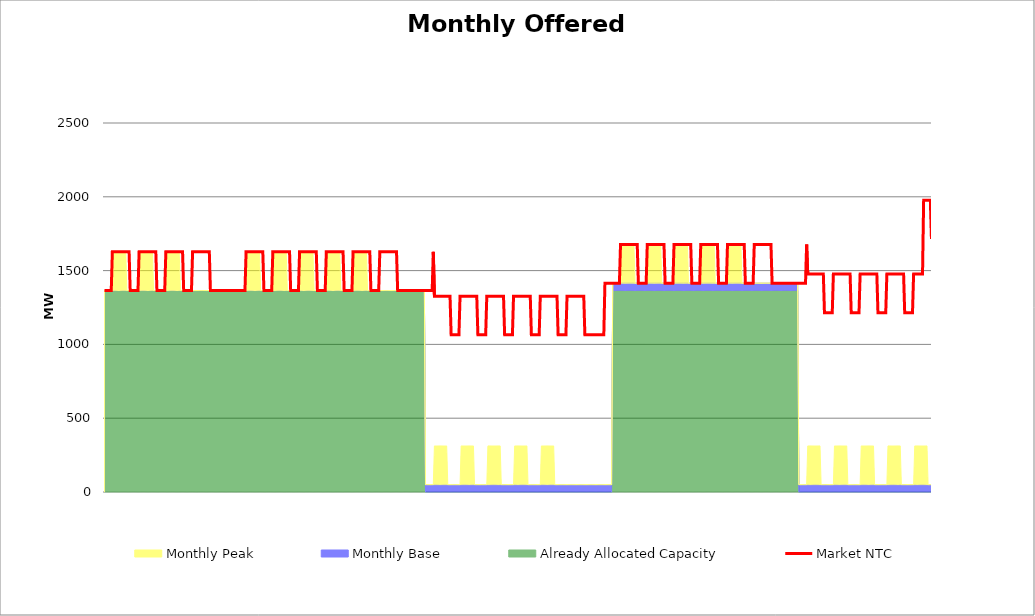
| Category | Market NTC |
|---|---|
| 0 | 1365 |
| 1 | 1365 |
| 2 | 1365 |
| 3 | 1365 |
| 4 | 1365 |
| 5 | 1365 |
| 6 | 1365 |
| 7 | 1627 |
| 8 | 1627 |
| 9 | 1627 |
| 10 | 1627 |
| 11 | 1627 |
| 12 | 1627 |
| 13 | 1627 |
| 14 | 1627 |
| 15 | 1627 |
| 16 | 1627 |
| 17 | 1627 |
| 18 | 1627 |
| 19 | 1627 |
| 20 | 1627 |
| 21 | 1627 |
| 22 | 1627 |
| 23 | 1365 |
| 24 | 1365 |
| 25 | 1365 |
| 26 | 1365 |
| 27 | 1365 |
| 28 | 1365 |
| 29 | 1365 |
| 30 | 1365 |
| 31 | 1627 |
| 32 | 1627 |
| 33 | 1627 |
| 34 | 1627 |
| 35 | 1627 |
| 36 | 1627 |
| 37 | 1627 |
| 38 | 1627 |
| 39 | 1627 |
| 40 | 1627 |
| 41 | 1627 |
| 42 | 1627 |
| 43 | 1627 |
| 44 | 1627 |
| 45 | 1627 |
| 46 | 1627 |
| 47 | 1365 |
| 48 | 1365 |
| 49 | 1365 |
| 50 | 1365 |
| 51 | 1365 |
| 52 | 1365 |
| 53 | 1365 |
| 54 | 1365 |
| 55 | 1627 |
| 56 | 1627 |
| 57 | 1627 |
| 58 | 1627 |
| 59 | 1627 |
| 60 | 1627 |
| 61 | 1627 |
| 62 | 1627 |
| 63 | 1627 |
| 64 | 1627 |
| 65 | 1627 |
| 66 | 1627 |
| 67 | 1627 |
| 68 | 1627 |
| 69 | 1627 |
| 70 | 1627 |
| 71 | 1365 |
| 72 | 1365 |
| 73 | 1365 |
| 74 | 1365 |
| 75 | 1365 |
| 76 | 1365 |
| 77 | 1365 |
| 78 | 1365 |
| 79 | 1627 |
| 80 | 1627 |
| 81 | 1627 |
| 82 | 1627 |
| 83 | 1627 |
| 84 | 1627 |
| 85 | 1627 |
| 86 | 1627 |
| 87 | 1627 |
| 88 | 1627 |
| 89 | 1627 |
| 90 | 1627 |
| 91 | 1627 |
| 92 | 1627 |
| 93 | 1627 |
| 94 | 1627 |
| 95 | 1365 |
| 96 | 1365 |
| 97 | 1365 |
| 98 | 1365 |
| 99 | 1365 |
| 100 | 1365 |
| 101 | 1365 |
| 102 | 1365 |
| 103 | 1365 |
| 104 | 1365 |
| 105 | 1365 |
| 106 | 1365 |
| 107 | 1365 |
| 108 | 1365 |
| 109 | 1365 |
| 110 | 1365 |
| 111 | 1365 |
| 112 | 1365 |
| 113 | 1365 |
| 114 | 1365 |
| 115 | 1365 |
| 116 | 1365 |
| 117 | 1365 |
| 118 | 1365 |
| 119 | 1365 |
| 120 | 1365 |
| 121 | 1365 |
| 122 | 1365 |
| 123 | 1365 |
| 124 | 1365 |
| 125 | 1365 |
| 126 | 1365 |
| 127 | 1627 |
| 128 | 1627 |
| 129 | 1627 |
| 130 | 1627 |
| 131 | 1627 |
| 132 | 1627 |
| 133 | 1627 |
| 134 | 1627 |
| 135 | 1627 |
| 136 | 1627 |
| 137 | 1627 |
| 138 | 1627 |
| 139 | 1627 |
| 140 | 1627 |
| 141 | 1627 |
| 142 | 1627 |
| 143 | 1365 |
| 144 | 1365 |
| 145 | 1365 |
| 146 | 1365 |
| 147 | 1365 |
| 148 | 1365 |
| 149 | 1365 |
| 150 | 1365 |
| 151 | 1627 |
| 152 | 1627 |
| 153 | 1627 |
| 154 | 1627 |
| 155 | 1627 |
| 156 | 1627 |
| 157 | 1627 |
| 158 | 1627 |
| 159 | 1627 |
| 160 | 1627 |
| 161 | 1627 |
| 162 | 1627 |
| 163 | 1627 |
| 164 | 1627 |
| 165 | 1627 |
| 166 | 1627 |
| 167 | 1365 |
| 168 | 1365 |
| 169 | 1365 |
| 170 | 1365 |
| 171 | 1365 |
| 172 | 1365 |
| 173 | 1365 |
| 174 | 1365 |
| 175 | 1627 |
| 176 | 1627 |
| 177 | 1627 |
| 178 | 1627 |
| 179 | 1627 |
| 180 | 1627 |
| 181 | 1627 |
| 182 | 1627 |
| 183 | 1627 |
| 184 | 1627 |
| 185 | 1627 |
| 186 | 1627 |
| 187 | 1627 |
| 188 | 1627 |
| 189 | 1627 |
| 190 | 1627 |
| 191 | 1365 |
| 192 | 1365 |
| 193 | 1365 |
| 194 | 1365 |
| 195 | 1365 |
| 196 | 1365 |
| 197 | 1365 |
| 198 | 1365 |
| 199 | 1627 |
| 200 | 1627 |
| 201 | 1627 |
| 202 | 1627 |
| 203 | 1627 |
| 204 | 1627 |
| 205 | 1627 |
| 206 | 1627 |
| 207 | 1627 |
| 208 | 1627 |
| 209 | 1627 |
| 210 | 1627 |
| 211 | 1627 |
| 212 | 1627 |
| 213 | 1627 |
| 214 | 1627 |
| 215 | 1365 |
| 216 | 1365 |
| 217 | 1365 |
| 218 | 1365 |
| 219 | 1365 |
| 220 | 1365 |
| 221 | 1365 |
| 222 | 1365 |
| 223 | 1627 |
| 224 | 1627 |
| 225 | 1627 |
| 226 | 1627 |
| 227 | 1627 |
| 228 | 1627 |
| 229 | 1627 |
| 230 | 1627 |
| 231 | 1627 |
| 232 | 1627 |
| 233 | 1627 |
| 234 | 1627 |
| 235 | 1627 |
| 236 | 1627 |
| 237 | 1627 |
| 238 | 1627 |
| 239 | 1365 |
| 240 | 1365 |
| 241 | 1365 |
| 242 | 1365 |
| 243 | 1365 |
| 244 | 1365 |
| 245 | 1365 |
| 246 | 1365 |
| 247 | 1627 |
| 248 | 1627 |
| 249 | 1627 |
| 250 | 1627 |
| 251 | 1627 |
| 252 | 1627 |
| 253 | 1627 |
| 254 | 1627 |
| 255 | 1627 |
| 256 | 1627 |
| 257 | 1627 |
| 258 | 1627 |
| 259 | 1627 |
| 260 | 1627 |
| 261 | 1627 |
| 262 | 1627 |
| 263 | 1365 |
| 264 | 1365 |
| 265 | 1365 |
| 266 | 1365 |
| 267 | 1365 |
| 268 | 1365 |
| 269 | 1365 |
| 270 | 1365 |
| 271 | 1365 |
| 272 | 1365 |
| 273 | 1365 |
| 274 | 1365 |
| 275 | 1365 |
| 276 | 1365 |
| 277 | 1365 |
| 278 | 1365 |
| 279 | 1365 |
| 280 | 1365 |
| 281 | 1365 |
| 282 | 1365 |
| 283 | 1365 |
| 284 | 1365 |
| 285 | 1365 |
| 286 | 1365 |
| 287 | 1365 |
| 288 | 1365 |
| 289 | 1365 |
| 290 | 1365 |
| 291 | 1365 |
| 292 | 1365 |
| 293 | 1365 |
| 294 | 1365 |
| 295 | 1627 |
| 296 | 1327 |
| 297 | 1327 |
| 298 | 1327 |
| 299 | 1327 |
| 300 | 1327 |
| 301 | 1327 |
| 302 | 1327 |
| 303 | 1327 |
| 304 | 1327 |
| 305 | 1327 |
| 306 | 1327 |
| 307 | 1327 |
| 308 | 1327 |
| 309 | 1327 |
| 310 | 1327 |
| 311 | 1065 |
| 312 | 1065 |
| 313 | 1065 |
| 314 | 1065 |
| 315 | 1065 |
| 316 | 1065 |
| 317 | 1065 |
| 318 | 1065 |
| 319 | 1327 |
| 320 | 1327 |
| 321 | 1327 |
| 322 | 1327 |
| 323 | 1327 |
| 324 | 1327 |
| 325 | 1327 |
| 326 | 1327 |
| 327 | 1327 |
| 328 | 1327 |
| 329 | 1327 |
| 330 | 1327 |
| 331 | 1327 |
| 332 | 1327 |
| 333 | 1327 |
| 334 | 1327 |
| 335 | 1065 |
| 336 | 1065 |
| 337 | 1065 |
| 338 | 1065 |
| 339 | 1065 |
| 340 | 1065 |
| 341 | 1065 |
| 342 | 1065 |
| 343 | 1327 |
| 344 | 1327 |
| 345 | 1327 |
| 346 | 1327 |
| 347 | 1327 |
| 348 | 1327 |
| 349 | 1327 |
| 350 | 1327 |
| 351 | 1327 |
| 352 | 1327 |
| 353 | 1327 |
| 354 | 1327 |
| 355 | 1327 |
| 356 | 1327 |
| 357 | 1327 |
| 358 | 1327 |
| 359 | 1065 |
| 360 | 1065 |
| 361 | 1065 |
| 362 | 1065 |
| 363 | 1065 |
| 364 | 1065 |
| 365 | 1065 |
| 366 | 1065 |
| 367 | 1327 |
| 368 | 1327 |
| 369 | 1327 |
| 370 | 1327 |
| 371 | 1327 |
| 372 | 1327 |
| 373 | 1327 |
| 374 | 1327 |
| 375 | 1327 |
| 376 | 1327 |
| 377 | 1327 |
| 378 | 1327 |
| 379 | 1327 |
| 380 | 1327 |
| 381 | 1327 |
| 382 | 1327 |
| 383 | 1065 |
| 384 | 1065 |
| 385 | 1065 |
| 386 | 1065 |
| 387 | 1065 |
| 388 | 1065 |
| 389 | 1065 |
| 390 | 1065 |
| 391 | 1327 |
| 392 | 1327 |
| 393 | 1327 |
| 394 | 1327 |
| 395 | 1327 |
| 396 | 1327 |
| 397 | 1327 |
| 398 | 1327 |
| 399 | 1327 |
| 400 | 1327 |
| 401 | 1327 |
| 402 | 1327 |
| 403 | 1327 |
| 404 | 1327 |
| 405 | 1327 |
| 406 | 1327 |
| 407 | 1065 |
| 408 | 1065 |
| 409 | 1065 |
| 410 | 1065 |
| 411 | 1065 |
| 412 | 1065 |
| 413 | 1065 |
| 414 | 1065 |
| 415 | 1327 |
| 416 | 1327 |
| 417 | 1327 |
| 418 | 1327 |
| 419 | 1327 |
| 420 | 1327 |
| 421 | 1327 |
| 422 | 1327 |
| 423 | 1327 |
| 424 | 1327 |
| 425 | 1327 |
| 426 | 1327 |
| 427 | 1327 |
| 428 | 1327 |
| 429 | 1327 |
| 430 | 1327 |
| 431 | 1065 |
| 432 | 1065 |
| 433 | 1065 |
| 434 | 1065 |
| 435 | 1065 |
| 436 | 1065 |
| 437 | 1065 |
| 438 | 1065 |
| 439 | 1065 |
| 440 | 1065 |
| 441 | 1065 |
| 442 | 1065 |
| 443 | 1065 |
| 444 | 1065 |
| 445 | 1065 |
| 446 | 1065 |
| 447 | 1065 |
| 448 | 1065 |
| 449 | 1415 |
| 450 | 1415 |
| 451 | 1415 |
| 452 | 1415 |
| 453 | 1415 |
| 454 | 1415 |
| 455 | 1415 |
| 456 | 1415 |
| 457 | 1415 |
| 458 | 1415 |
| 459 | 1415 |
| 460 | 1415 |
| 461 | 1415 |
| 462 | 1415 |
| 463 | 1677 |
| 464 | 1677 |
| 465 | 1677 |
| 466 | 1677 |
| 467 | 1677 |
| 468 | 1677 |
| 469 | 1677 |
| 470 | 1677 |
| 471 | 1677 |
| 472 | 1677 |
| 473 | 1677 |
| 474 | 1677 |
| 475 | 1677 |
| 476 | 1677 |
| 477 | 1677 |
| 478 | 1677 |
| 479 | 1415 |
| 480 | 1415 |
| 481 | 1415 |
| 482 | 1415 |
| 483 | 1415 |
| 484 | 1415 |
| 485 | 1415 |
| 486 | 1415 |
| 487 | 1677 |
| 488 | 1677 |
| 489 | 1677 |
| 490 | 1677 |
| 491 | 1677 |
| 492 | 1677 |
| 493 | 1677 |
| 494 | 1677 |
| 495 | 1677 |
| 496 | 1677 |
| 497 | 1677 |
| 498 | 1677 |
| 499 | 1677 |
| 500 | 1677 |
| 501 | 1677 |
| 502 | 1677 |
| 503 | 1415 |
| 504 | 1415 |
| 505 | 1415 |
| 506 | 1415 |
| 507 | 1415 |
| 508 | 1415 |
| 509 | 1415 |
| 510 | 1415 |
| 511 | 1677 |
| 512 | 1677 |
| 513 | 1677 |
| 514 | 1677 |
| 515 | 1677 |
| 516 | 1677 |
| 517 | 1677 |
| 518 | 1677 |
| 519 | 1677 |
| 520 | 1677 |
| 521 | 1677 |
| 522 | 1677 |
| 523 | 1677 |
| 524 | 1677 |
| 525 | 1677 |
| 526 | 1677 |
| 527 | 1415 |
| 528 | 1415 |
| 529 | 1415 |
| 530 | 1415 |
| 531 | 1415 |
| 532 | 1415 |
| 533 | 1415 |
| 534 | 1415 |
| 535 | 1677 |
| 536 | 1677 |
| 537 | 1677 |
| 538 | 1677 |
| 539 | 1677 |
| 540 | 1677 |
| 541 | 1677 |
| 542 | 1677 |
| 543 | 1677 |
| 544 | 1677 |
| 545 | 1677 |
| 546 | 1677 |
| 547 | 1677 |
| 548 | 1677 |
| 549 | 1677 |
| 550 | 1677 |
| 551 | 1415 |
| 552 | 1415 |
| 553 | 1415 |
| 554 | 1415 |
| 555 | 1415 |
| 556 | 1415 |
| 557 | 1415 |
| 558 | 1415 |
| 559 | 1677 |
| 560 | 1677 |
| 561 | 1677 |
| 562 | 1677 |
| 563 | 1677 |
| 564 | 1677 |
| 565 | 1677 |
| 566 | 1677 |
| 567 | 1677 |
| 568 | 1677 |
| 569 | 1677 |
| 570 | 1677 |
| 571 | 1677 |
| 572 | 1677 |
| 573 | 1677 |
| 574 | 1677 |
| 575 | 1415 |
| 576 | 1415 |
| 577 | 1415 |
| 578 | 1415 |
| 579 | 1415 |
| 580 | 1415 |
| 581 | 1415 |
| 582 | 1415 |
| 583 | 1677 |
| 584 | 1677 |
| 585 | 1677 |
| 586 | 1677 |
| 587 | 1677 |
| 588 | 1677 |
| 589 | 1677 |
| 590 | 1677 |
| 591 | 1677 |
| 592 | 1677 |
| 593 | 1677 |
| 594 | 1677 |
| 595 | 1677 |
| 596 | 1677 |
| 597 | 1677 |
| 598 | 1677 |
| 599 | 1415 |
| 600 | 1415 |
| 601 | 1415 |
| 602 | 1415 |
| 603 | 1415 |
| 604 | 1415 |
| 605 | 1415 |
| 606 | 1415 |
| 607 | 1415 |
| 608 | 1415 |
| 609 | 1415 |
| 610 | 1415 |
| 611 | 1415 |
| 612 | 1415 |
| 613 | 1415 |
| 614 | 1415 |
| 615 | 1415 |
| 616 | 1415 |
| 617 | 1415 |
| 618 | 1415 |
| 619 | 1415 |
| 620 | 1415 |
| 621 | 1415 |
| 622 | 1415 |
| 623 | 1415 |
| 624 | 1415 |
| 625 | 1415 |
| 626 | 1415 |
| 627 | 1415 |
| 628 | 1415 |
| 629 | 1415 |
| 630 | 1677 |
| 631 | 1477 |
| 632 | 1477 |
| 633 | 1477 |
| 634 | 1477 |
| 635 | 1477 |
| 636 | 1477 |
| 637 | 1477 |
| 638 | 1477 |
| 639 | 1477 |
| 640 | 1477 |
| 641 | 1477 |
| 642 | 1477 |
| 643 | 1477 |
| 644 | 1477 |
| 645 | 1477 |
| 646 | 1215 |
| 647 | 1215 |
| 648 | 1215 |
| 649 | 1215 |
| 650 | 1215 |
| 651 | 1215 |
| 652 | 1215 |
| 653 | 1215 |
| 654 | 1477 |
| 655 | 1477 |
| 656 | 1477 |
| 657 | 1477 |
| 658 | 1477 |
| 659 | 1477 |
| 660 | 1477 |
| 661 | 1477 |
| 662 | 1477 |
| 663 | 1477 |
| 664 | 1477 |
| 665 | 1477 |
| 666 | 1477 |
| 667 | 1477 |
| 668 | 1477 |
| 669 | 1477 |
| 670 | 1215 |
| 671 | 1215 |
| 672 | 1215 |
| 673 | 1215 |
| 674 | 1215 |
| 675 | 1215 |
| 676 | 1215 |
| 677 | 1215 |
| 678 | 1477 |
| 679 | 1477 |
| 680 | 1477 |
| 681 | 1477 |
| 682 | 1477 |
| 683 | 1477 |
| 684 | 1477 |
| 685 | 1477 |
| 686 | 1477 |
| 687 | 1477 |
| 688 | 1477 |
| 689 | 1477 |
| 690 | 1477 |
| 691 | 1477 |
| 692 | 1477 |
| 693 | 1477 |
| 694 | 1215 |
| 695 | 1215 |
| 696 | 1215 |
| 697 | 1215 |
| 698 | 1215 |
| 699 | 1215 |
| 700 | 1215 |
| 701 | 1215 |
| 702 | 1477 |
| 703 | 1477 |
| 704 | 1477 |
| 705 | 1477 |
| 706 | 1477 |
| 707 | 1477 |
| 708 | 1477 |
| 709 | 1477 |
| 710 | 1477 |
| 711 | 1477 |
| 712 | 1477 |
| 713 | 1477 |
| 714 | 1477 |
| 715 | 1477 |
| 716 | 1477 |
| 717 | 1477 |
| 718 | 1215 |
| 719 | 1215 |
| 720 | 1215 |
| 721 | 1215 |
| 722 | 1215 |
| 723 | 1215 |
| 724 | 1215 |
| 725 | 1215 |
| 726 | 1477 |
| 727 | 1477 |
| 728 | 1477 |
| 729 | 1477 |
| 730 | 1477 |
| 731 | 1477 |
| 732 | 1477 |
| 733 | 1477 |
| 734 | 1477 |
| 735 | 1977 |
| 736 | 1977 |
| 737 | 1977 |
| 738 | 1977 |
| 739 | 1977 |
| 740 | 1977 |
| 741 | 1977 |
| 742 | 1715 |